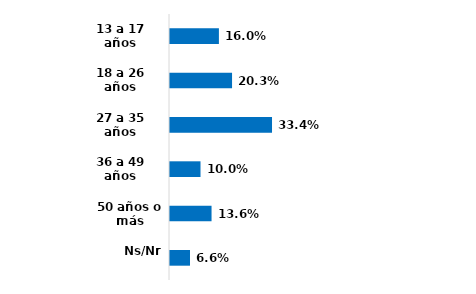
| Category | Series 0 |
|---|---|
| 13 a 17 años | 0.16 |
| 18 a 26 años | 0.203 |
| 27 a 35 años | 0.334 |
| 36 a 49 años | 0.1 |
| 50 años o más | 0.136 |
| Ns/Nr | 0.066 |